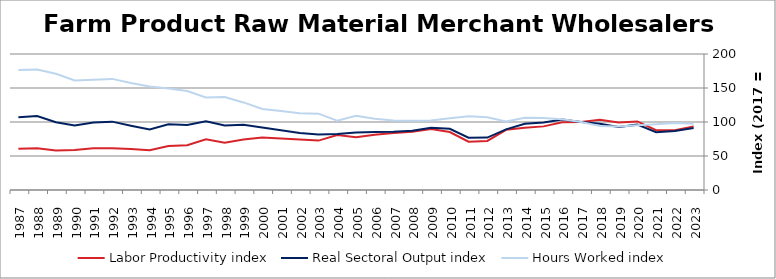
| Category | Labor Productivity index | Real Sectoral Output index | Hours Worked index |
|---|---|---|---|
| 2023.0 | 93.546 | 91.068 | 97.351 |
| 2022.0 | 87.983 | 86.822 | 98.68 |
| 2021.0 | 87.921 | 85.113 | 96.806 |
| 2020.0 | 100.888 | 96.114 | 95.268 |
| 2019.0 | 99.193 | 92.604 | 93.357 |
| 2018.0 | 103.332 | 97.344 | 94.205 |
| 2017.0 | 100 | 100 | 100 |
| 2016.0 | 99.642 | 103.641 | 104.013 |
| 2015.0 | 93.559 | 99.154 | 105.98 |
| 2014.0 | 91.655 | 97.512 | 106.39 |
| 2013.0 | 88.537 | 89.199 | 100.748 |
| 2012.0 | 72.135 | 77.085 | 106.862 |
| 2011.0 | 70.948 | 76.933 | 108.435 |
| 2010.0 | 85.258 | 90.079 | 105.655 |
| 2009.0 | 89.693 | 91.586 | 102.11 |
| 2008.0 | 85.583 | 87.176 | 101.861 |
| 2007.0 | 83.739 | 85.648 | 102.28 |
| 2006.0 | 81.293 | 85.236 | 104.85 |
| 2005.0 | 77.547 | 84.537 | 109.014 |
| 2004.0 | 80.726 | 82.289 | 101.936 |
| 2003.0 | 72.63 | 81.565 | 112.302 |
| 2002.0 | 74.366 | 83.86 | 112.766 |
| 2001.0 | 75.775 | 87.926 | 116.037 |
| 2000.0 | 77.243 | 92.055 | 119.177 |
| 1999.0 | 74.389 | 95.811 | 128.798 |
| 1998.0 | 69.437 | 94.953 | 136.747 |
| 1997.0 | 74.429 | 101.174 | 135.934 |
| 1996.0 | 65.837 | 95.763 | 145.454 |
| 1995.0 | 64.762 | 96.624 | 149.199 |
| 1994.0 | 58.381 | 88.888 | 152.255 |
| 1993.0 | 60.13 | 94.594 | 157.317 |
| 1992.0 | 61.533 | 100.537 | 163.388 |
| 1991.0 | 61.219 | 99.201 | 162.042 |
| 1990.0 | 58.97 | 94.914 | 160.954 |
| 1989.0 | 58.206 | 99.561 | 171.05 |
| 1988.0 | 61.426 | 108.845 | 177.196 |
| 1987.0 | 60.582 | 106.946 | 176.532 |